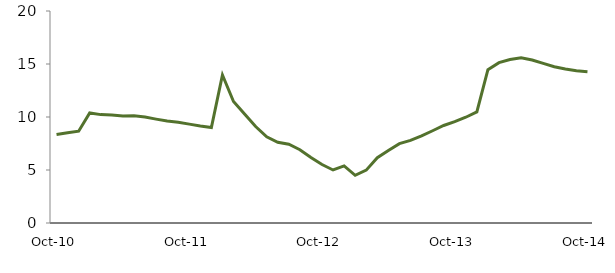
| Category | Series 0 |
|---|---|
| Oct-10 | 8.355 |
|  | 8.51 |
|  | 8.658 |
|  | 10.387 |
|  | 10.226 |
|  | 10.187 |
|  | 10.098 |
|  | 10.112 |
|  | 9.997 |
|  | 9.799 |
|  | 9.617 |
|  | 9.496 |
| Oct-11 | 9.328 |
|  | 9.151 |
|  | 9.003 |
|  | 13.958 |
|  | 11.462 |
|  | 10.275 |
|  | 9.102 |
|  | 8.135 |
|  | 7.62 |
|  | 7.427 |
|  | 6.915 |
|  | 6.173 |
| Oct-12 | 5.517 |
|  | 5.001 |
|  | 5.391 |
|  | 4.502 |
|  | 4.988 |
|  | 6.155 |
|  | 6.846 |
|  | 7.49 |
|  | 7.793 |
|  | 8.223 |
|  | 8.703 |
|  | 9.197 |
| Oct-13 | 9.564 |
|  | 9.978 |
|  | 10.478 |
|  | 14.467 |
|  | 15.129 |
|  | 15.422 |
|  | 15.593 |
|  | 15.372 |
|  | 15.054 |
|  | 14.745 |
|  | 14.529 |
|  | 14.365 |
| Oct-14 | 14.273 |